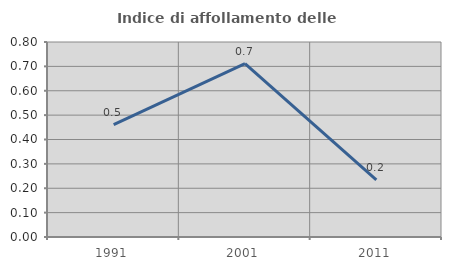
| Category | Indice di affollamento delle abitazioni  |
|---|---|
| 1991.0 | 0.461 |
| 2001.0 | 0.711 |
| 2011.0 | 0.235 |